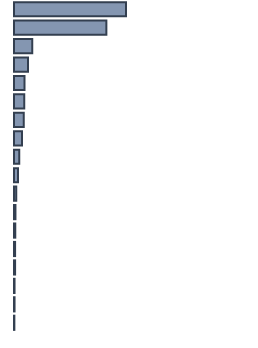
| Category | Percentatge |
|---|---|
| 0 | 46.667 |
| 1 | 38.485 |
| 2 | 7.652 |
| 3 | 5.833 |
| 4 | 4.394 |
| 5 | 4.318 |
| 6 | 4.015 |
| 7 | 3.333 |
| 8 | 2.197 |
| 9 | 1.667 |
| 10 | 0.909 |
| 11 | 0.606 |
| 12 | 0.53 |
| 13 | 0.455 |
| 14 | 0.455 |
| 15 | 0.227 |
| 16 | 0.227 |
| 17 | 0.152 |